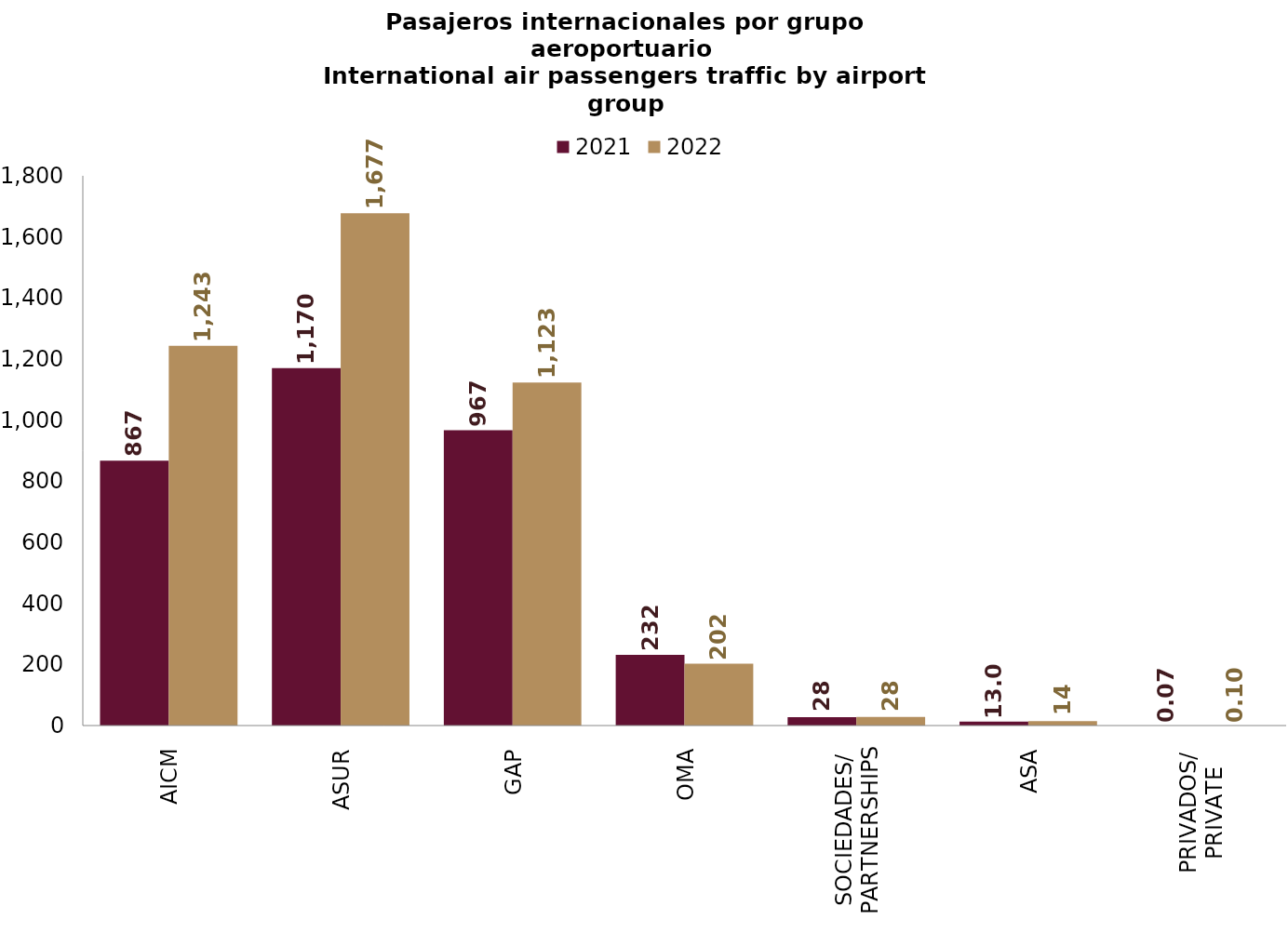
| Category | 2021 | 2022 |
|---|---|---|
| AICM | 867.347 | 1243.148 |
| ASUR | 1170.401 | 1677.254 |
| GAP | 966.996 | 1122.907 |
| OMA | 231.66 | 202.387 |
| SOCIEDADES/
PARTNERSHIPS | 27.634 | 28.221 |
| ASA | 12.987 | 14.16 |
| PRIVADOS/
PRIVATE | 0.067 | 0.099 |